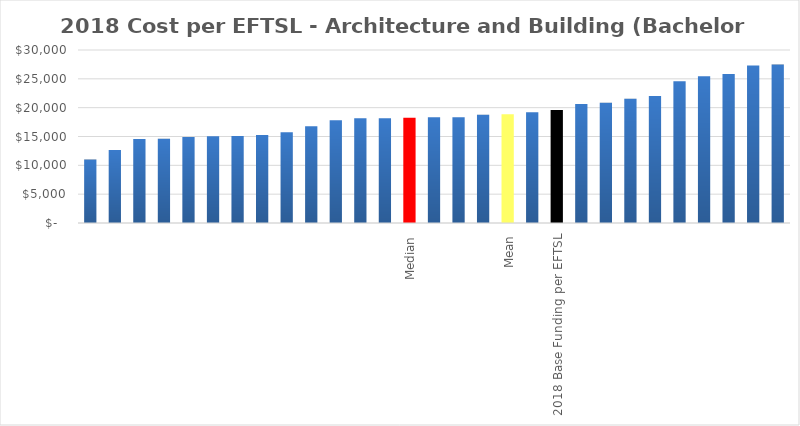
| Category | Series 0 |
|---|---|
|  | 11010.667 |
|  | 12648.916 |
|  | 14579.29 |
|  | 14596.503 |
|  | 14913.838 |
|  | 15060.3 |
|  | 15072.743 |
|  | 15257.845 |
|  | 15728.833 |
|  | 16796.027 |
|  | 17802.444 |
|  | 18155.335 |
|  | 18160.69 |
| Median | 18255.392 |
|  | 18350.093 |
|  | 18354.002 |
|  | 18782.22 |
| Mean | 18854.85 |
|  | 19210.83 |
| 2018 Base Funding per EFTSL | 19617 |